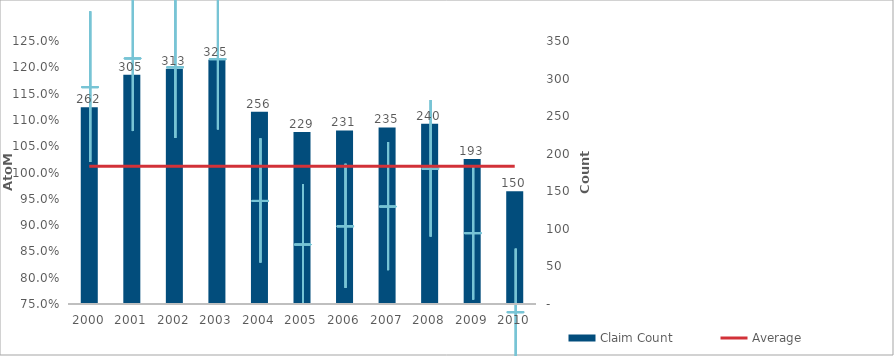
| Category | Claim Count |
|---|---|
| 0 | 262 |
| 1 | 305 |
| 2 | 313 |
| 3 | 325 |
| 4 | 256 |
| 5 | 229 |
| 6 | 231 |
| 7 | 235 |
| 8 | 240 |
| 9 | 193 |
| 10 | 150 |